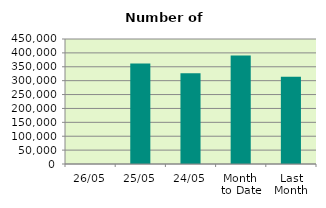
| Category | Series 0 |
|---|---|
| 26/05 | 0 |
| 25/05 | 362002 |
| 24/05 | 326436 |
| Month 
to Date | 390352.706 |
| Last
Month | 313751.158 |